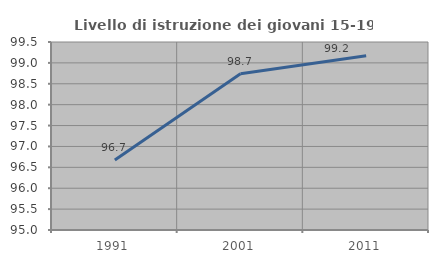
| Category | Livello di istruzione dei giovani 15-19 anni |
|---|---|
| 1991.0 | 96.675 |
| 2001.0 | 98.739 |
| 2011.0 | 99.17 |